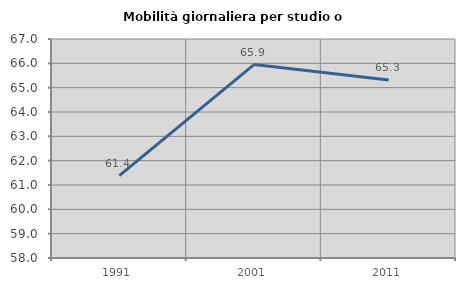
| Category | Mobilità giornaliera per studio o lavoro |
|---|---|
| 1991.0 | 61.385 |
| 2001.0 | 65.948 |
| 2011.0 | 65.318 |